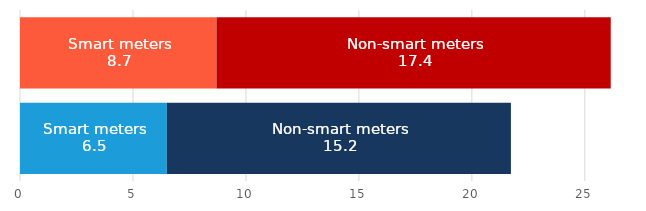
| Category | Smart meters | Non-smart meters |
|---|---|---|
| Gas | 6498117 | 15230884 |
| Electricity | 8697324 | 17449993 |